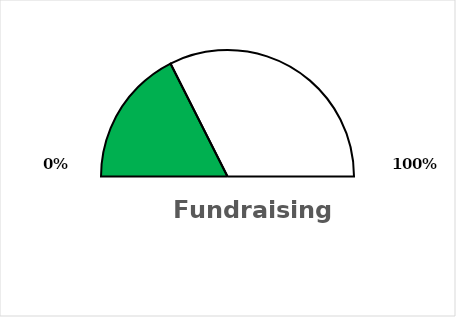
| Category | Series 0 |
|---|---|
| 0 | 0.176 |
| 1 | 0.324 |
| 2 | 0.5 |